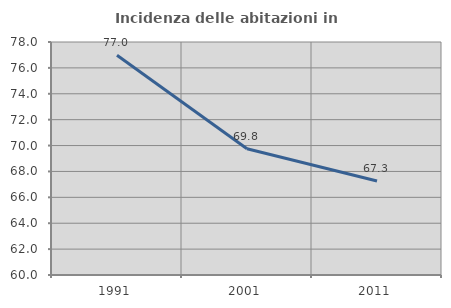
| Category | Incidenza delle abitazioni in proprietà  |
|---|---|
| 1991.0 | 76.982 |
| 2001.0 | 69.752 |
| 2011.0 | 67.257 |